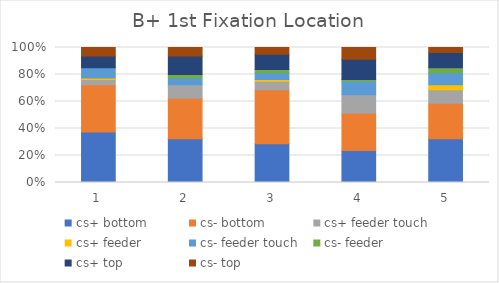
| Category | cs+ bottom | cs- bottom | cs+ feeder touch | cs+ feeder | cs- feeder touch | cs- feeder | cs+ top | cs- top |
|---|---|---|---|---|---|---|---|---|
| 0 | 30 | 28 | 3 | 1 | 6 | 0 | 7 | 5 |
| 1 | 26 | 24 | 8 | 0 | 4 | 2 | 11 | 5 |
| 2 | 23 | 32 | 5 | 1 | 4 | 2 | 9 | 4 |
| 3 | 19 | 22 | 11 | 0 | 8 | 1 | 12 | 7 |
| 4 | 26 | 21 | 8 | 3 | 7 | 3 | 9 | 3 |